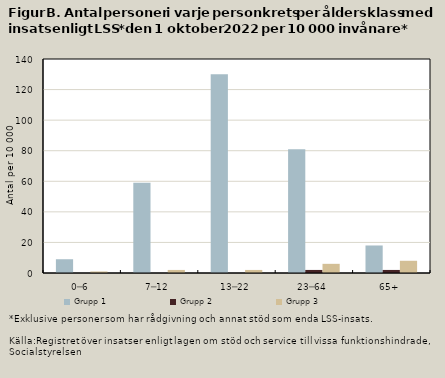
| Category | Grupp 1 | Grupp 2 | Grupp 3 |
|---|---|---|---|
| 0─6 | 9 | 0 | 1 |
| 7─12 | 59 | 0 | 2 |
| 13─22 | 130 | 0 | 2 |
| 23─64 | 81 | 2 | 6 |
| 65+ | 18 | 2 | 8 |